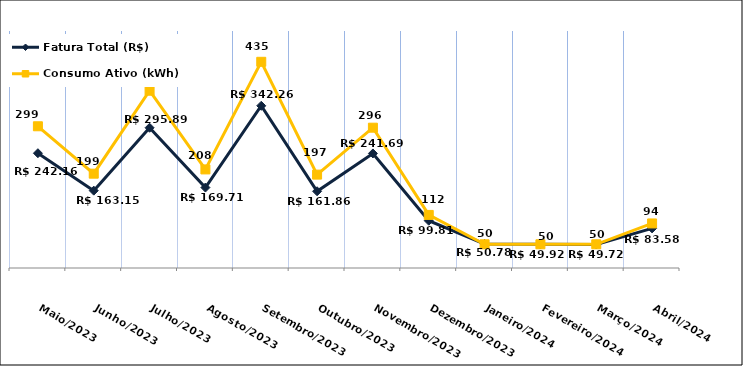
| Category | Fatura Total (R$) |
|---|---|
| Maio/2023 | 242.16 |
| Junho/2023 | 163.15 |
| Julho/2023 | 295.89 |
| Agosto/2023 | 169.71 |
| Setembro/2023 | 342.26 |
| Outubro/2023 | 161.86 |
| Novembro/2023 | 241.69 |
| Dezembro/2023 | 99.81 |
| Janeiro/2024 | 50.78 |
| Fevereiro/2024 | 49.92 |
| Março/2024 | 49.72 |
| Abril/2024 | 83.58 |